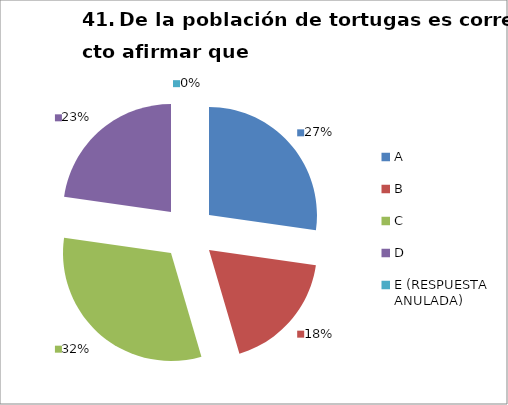
| Category | CANTIDAD DE RESPUESTAS PREGUNTA (41) | PORCENTAJE |
|---|---|---|
| A | 6 | 0.273 |
| B | 4 | 0.182 |
| C | 7 | 0.318 |
| D | 5 | 0.227 |
| E (RESPUESTA ANULADA) | 0 | 0 |